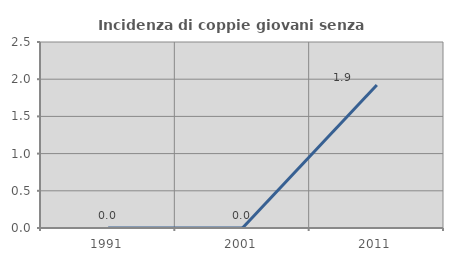
| Category | Incidenza di coppie giovani senza figli |
|---|---|
| 1991.0 | 0 |
| 2001.0 | 0 |
| 2011.0 | 1.923 |